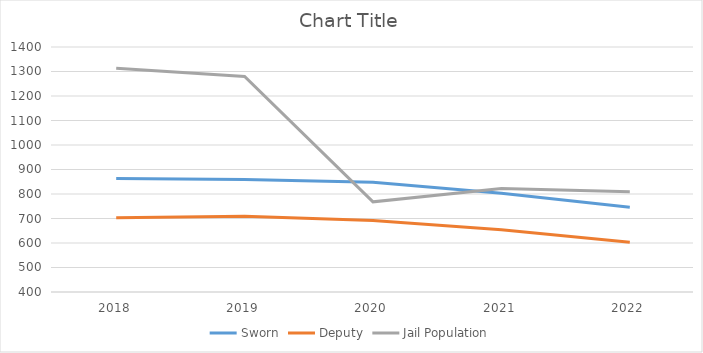
| Category | Sworn | Deputy | Jail Population |
|---|---|---|---|
| 2018.0 | 863 | 703 | 1313 |
| 2019.0 | 859 | 709 | 1280 |
| 2020.0 | 848 | 692 | 768 |
| 2021.0 | 803 | 654 | 822 |
| 2022.0 | 746 | 603 | 809 |